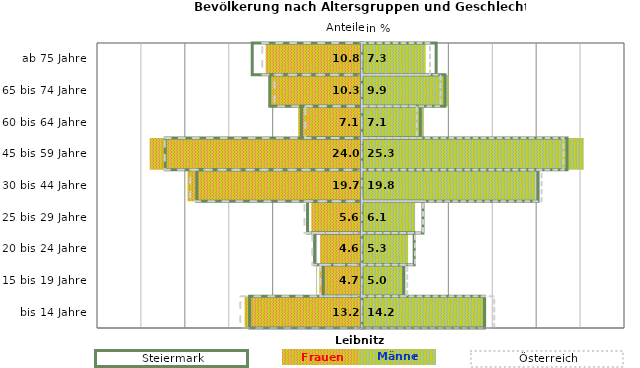
| Category | Frauen | Männer | Frauen Spalte2 | Männer Spalte2 | Frauen Spalte3 | Männer Spalte3 |
|---|---|---|---|---|---|---|
| bis 14 Jahre | -13.2 | 14.2 | 14 | -12.8 | -13.8 | 15.1 |
| 15 bis 19 Jahre | -4.7 | 5 | 4.8 | -4.4 | -4.7 | 5.2 |
| 20 bis 24 Jahre | -4.6 | 5.3 | 6 | -5.4 | -5.6 | 6.1 |
| 25 bis 29 Jahre | -5.6 | 6.1 | 7 | -6.2 | -6.5 | 7 |
| 30 bis 44 Jahre | -19.7 | 19.8 | 20.1 | -18.8 | -19.5 | 20.5 |
| 45 bis 59 Jahre | -24 | 25.3 | 23.4 | -22.4 | -22.4 | 23 |
| 60 bis 64 Jahre | -7.1 | 7.1 | 6.7 | -6.9 | -6.4 | 6.3 |
| 65 bis 74 Jahre | -10.3 | 9.9 | 9.5 | -10.5 | -9.9 | 9 |
| ab 75 Jahre | -10.8 | 7.3 | 8.5 | -12.5 | -11.3 | 7.8 |